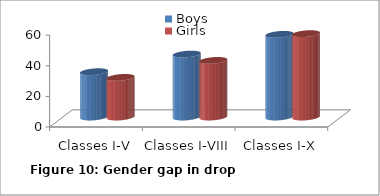
| Category | Boys | Girls |
|---|---|---|
| Classes I-V | 29.572 | 25.848 |
| Classes I-VIII | 41.092 | 36.945 |
| Classes I-X | 53.976 | 54.428 |